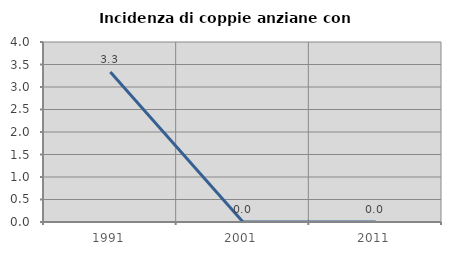
| Category | Incidenza di coppie anziane con figli |
|---|---|
| 1991.0 | 3.333 |
| 2001.0 | 0 |
| 2011.0 | 0 |